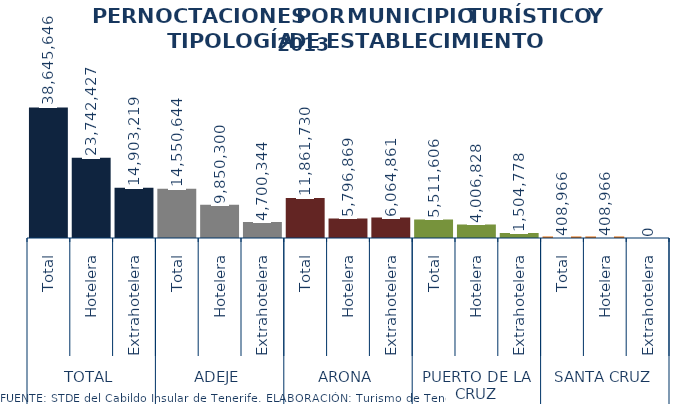
| Category | 2013 |
|---|---|
| 0 | 38645646 |
| 1 | 23742427 |
| 2 | 14903219 |
| 3 | 14550644 |
| 4 | 9850300 |
| 5 | 4700344 |
| 6 | 11861730 |
| 7 | 5796869 |
| 8 | 6064861 |
| 9 | 5511606 |
| 10 | 4006828 |
| 11 | 1504778 |
| 12 | 408966 |
| 13 | 408966 |
| 14 | 0 |